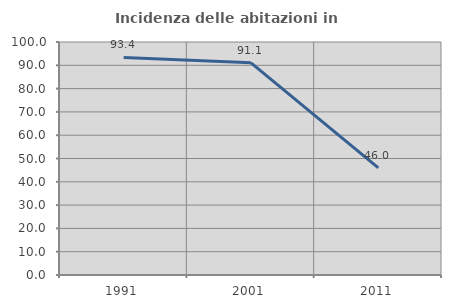
| Category | Incidenza delle abitazioni in proprietà  |
|---|---|
| 1991.0 | 93.373 |
| 2001.0 | 91.071 |
| 2011.0 | 45.977 |